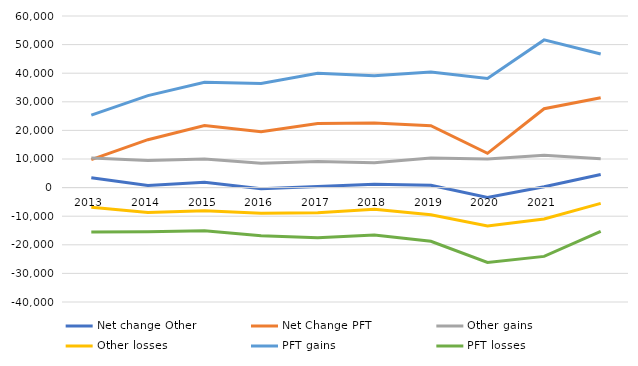
| Category | Net change Other  | Net Change PFT  | Other gains | Other losses | PFT gains | PFT losses |
|---|---|---|---|---|---|---|
| 2013.0 | 3464 | 9787 | 10346 | -6882 | 25315 | -15528 |
| 2014.0 | 731 | 16753 | 9449 | -8718 | 32166 | -15413 |
| 2015.0 | 1892 | 21704 | 9988 | -8096 | 36803 | -15099 |
| 2016.0 | -402 | 19556 | 8536 | -8938 | 36382 | -16826 |
| 2017.0 | 363 | 22386 | 9117 | -8754 | 39947 | -17561 |
| 2018.0 | 1148 | 22571 | 8681 | -7533 | 39145 | -16574 |
| 2019.0 | 804 | 21656 | 10328 | -9524 | 40414 | -18758 |
| 2020.0 | -3439 | 11982 | 10010 | -13449 | 38134 | -26152 |
| 2021.0 | 330 | 27587 | 11330 | -11000 | 51637 | -24050 |